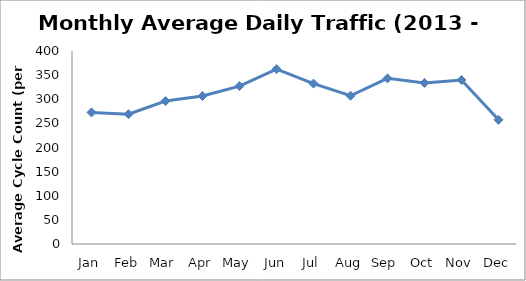
| Category | Series 0 |
|---|---|
| Jan | 272.75 |
| Feb | 269 |
| Mar | 296.25 |
| Apr | 306.75 |
| May | 327.25 |
| Jun | 362.5 |
| Jul | 332.5 |
| Aug | 307.25 |
| Sep | 343.25 |
| Oct | 333.75 |
| Nov | 340 |
| Dec | 257.5 |